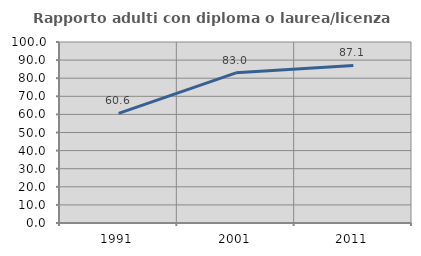
| Category | Rapporto adulti con diploma o laurea/licenza media  |
|---|---|
| 1991.0 | 60.606 |
| 2001.0 | 82.96 |
| 2011.0 | 87.083 |